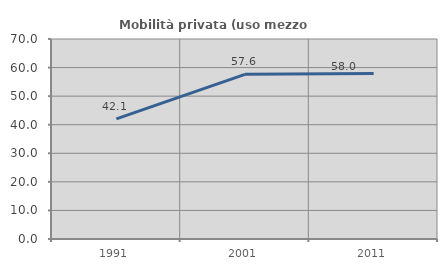
| Category | Mobilità privata (uso mezzo privato) |
|---|---|
| 1991.0 | 42.067 |
| 2001.0 | 57.642 |
| 2011.0 | 57.961 |